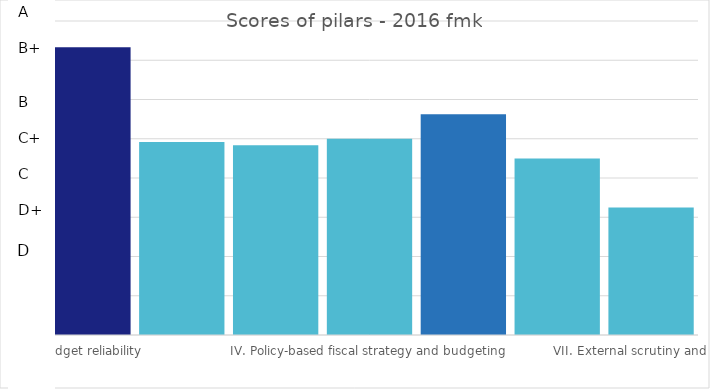
| Category | 4. HIGH | 3. SOUND | 2. BASIC | 1. BELOW BASIC |
|---|---|---|---|---|
| I. Budget reliability  | 3.667 | 0 | 0 | 0 |
| II. Transparency of public finances   | 0 | 0 | 2.458 | 0 |
| III. Management of assets and liabilities   | 0 | 0 | 2.417 | 0 |
| IV. Policy-based fiscal strategy and budgeting  | 0 | 0 | 2.5 | 0 |
| V. Predictability and control in budget execution  | 0 | 2.812 | 0 | 0 |
| VI. Accounting and reporting  | 0 | 0 | 2.25 | 0 |
| VII. External scrutiny and audit   | 0 | 0 | 1.625 | 0 |